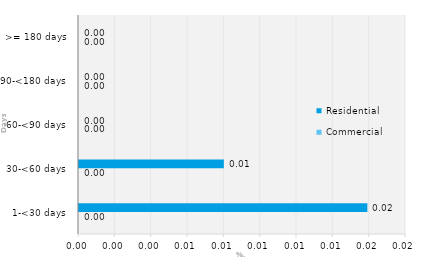
| Category | Commercial | Residential |
|---|---|---|
| 1-<30 days | 0 | 0.016 |
| 30-<60 days | 0 | 0.008 |
| 60-<90 days | 0 | 0 |
| 90-<180 days | 0 | 0 |
| >= 180 days | 0 | 0 |